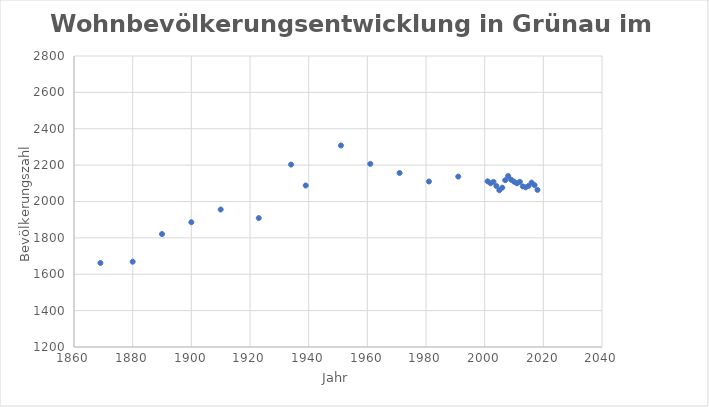
| Category | a |
|---|---|
| 1869.0 | 1662 |
| 1880.0 | 1669 |
| 1890.0 | 1821 |
| 1900.0 | 1886 |
| 1910.0 | 1956 |
| 1923.0 | 1909 |
| 1934.0 | 2203 |
| 1939.0 | 2088 |
| 1951.0 | 2308 |
| 1961.0 | 2207 |
| 1971.0 | 2157 |
| 1981.0 | 2110 |
| 1991.0 | 2137 |
| 2001.0 | 2111 |
| 2002.0 | 2100 |
| 2003.0 | 2108 |
| 2004.0 | 2085 |
| 2005.0 | 2062 |
| 2006.0 | 2076 |
| 2007.0 | 2117 |
| 2008.0 | 2140 |
| 2009.0 | 2120 |
| 2010.0 | 2109 |
| 2011.0 | 2100 |
| 2012.0 | 2108 |
| 2013.0 | 2083 |
| 2014.0 | 2078 |
| 2015.0 | 2086 |
| 2016.0 | 2104 |
| 2017.0 | 2090 |
| 2018.0 | 2064 |